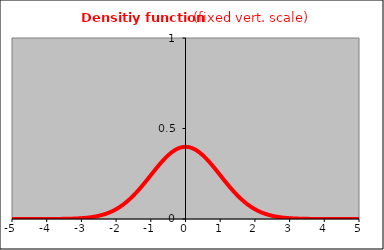
| Category | Series 0 |
|---|---|
| -10.0 | 0 |
| -9.9 | 0 |
| -9.8 | 0 |
| -9.7 | 0 |
| -9.6 | 0 |
| -9.5 | 0 |
| -9.4 | 0 |
| -9.3 | 0 |
| -9.2 | 0 |
| -9.1 | 0 |
| -9.0 | 0 |
| -8.9 | 0 |
| -8.8 | 0 |
| -8.7 | 0 |
| -8.6 | 0 |
| -8.5 | 0 |
| -8.40000000000001 | 0 |
| -8.30000000000001 | 0 |
| -8.20000000000001 | 0 |
| -8.10000000000001 | 0 |
| -8.00000000000001 | 0 |
| -7.90000000000001 | 0 |
| -7.80000000000001 | 0 |
| -7.70000000000001 | 0 |
| -7.60000000000001 | 0 |
| -7.50000000000001 | 0 |
| -7.40000000000001 | 0 |
| -7.30000000000001 | 0 |
| -7.20000000000001 | 0 |
| -7.10000000000001 | 0 |
| -7.00000000000001 | 0 |
| -6.90000000000001 | 0 |
| -6.80000000000001 | 0 |
| -6.70000000000001 | 0 |
| -6.60000000000001 | 0 |
| -6.50000000000001 | 0 |
| -6.40000000000001 | 0 |
| -6.30000000000001 | 0 |
| -6.20000000000001 | 0 |
| -6.10000000000001 | 0 |
| -6.00000000000001 | 0 |
| -5.90000000000001 | 0 |
| -5.80000000000001 | 0 |
| -5.70000000000001 | 0 |
| -5.60000000000002 | 0 |
| -5.50000000000002 | 0 |
| -5.40000000000002 | 0 |
| -5.30000000000002 | 0 |
| -5.20000000000002 | 0 |
| -5.10000000000002 | 0 |
| -5.00000000000002 | 0 |
| -4.90000000000002 | 0 |
| -4.80000000000002 | 0 |
| -4.70000000000002 | 0 |
| -4.60000000000002 | 0 |
| -4.50000000000002 | 0 |
| -4.40000000000002 | 0 |
| -4.30000000000002 | 0 |
| -4.20000000000002 | 0 |
| -4.10000000000002 | 0 |
| -4.00000000000002 | 0 |
| -3.90000000000002 | 0 |
| -3.80000000000002 | 0 |
| -3.70000000000002 | 0 |
| -3.60000000000002 | 0.001 |
| -3.50000000000002 | 0.001 |
| -3.40000000000002 | 0.001 |
| -3.30000000000002 | 0.002 |
| -3.20000000000002 | 0.002 |
| -3.10000000000002 | 0.003 |
| -3.00000000000002 | 0.004 |
| -2.90000000000002 | 0.006 |
| -2.80000000000003 | 0.008 |
| -2.70000000000003 | 0.01 |
| -2.60000000000003 | 0.014 |
| -2.50000000000003 | 0.018 |
| -2.40000000000003 | 0.022 |
| -2.30000000000003 | 0.028 |
| -2.20000000000003 | 0.035 |
| -2.10000000000003 | 0.044 |
| -2.00000000000003 | 0.054 |
| -1.90000000000003 | 0.066 |
| -1.80000000000003 | 0.079 |
| -1.70000000000003 | 0.094 |
| -1.60000000000003 | 0.111 |
| -1.50000000000003 | 0.13 |
| -1.40000000000003 | 0.15 |
| -1.30000000000003 | 0.171 |
| -1.20000000000003 | 0.194 |
| -1.10000000000003 | 0.218 |
| -1.00000000000003 | 0.242 |
| -0.900000000000031 | 0.266 |
| -0.800000000000031 | 0.29 |
| -0.700000000000029 | 0.312 |
| -0.60000000000003 | 0.333 |
| -0.50000000000003 | 0.352 |
| -0.400000000000031 | 0.368 |
| -0.300000000000031 | 0.381 |
| -0.200000000000029 | 0.391 |
| -0.10000000000003 | 0.397 |
| -4.08562073062058e-14 | 0.399 |
| 0.0999999999999588 | 0.397 |
| 0.199999999999999 | 0.391 |
| 0.299999999999999 | 0.381 |
| 0.4 | 0.368 |
| 0.5 | 0.352 |
| 0.6 | 0.333 |
| 0.699999999999999 | 0.312 |
| 0.799999999999999 | 0.29 |
| 0.9 | 0.266 |
| 1.0 | 0.242 |
| 1.1 | 0.218 |
| 1.2 | 0.194 |
| 1.3 | 0.171 |
| 1.4 | 0.15 |
| 1.5 | 0.13 |
| 1.6 | 0.111 |
| 1.7 | 0.094 |
| 1.8 | 0.079 |
| 1.9 | 0.066 |
| 2.0 | 0.054 |
| 2.1 | 0.044 |
| 2.2 | 0.035 |
| 2.3 | 0.028 |
| 2.4 | 0.022 |
| 2.5 | 0.018 |
| 2.6 | 0.014 |
| 2.7 | 0.01 |
| 2.8 | 0.008 |
| 2.9 | 0.006 |
| 3.0 | 0.004 |
| 3.1 | 0.003 |
| 3.2 | 0.002 |
| 3.3 | 0.002 |
| 3.4 | 0.001 |
| 3.5 | 0.001 |
| 3.6 | 0.001 |
| 3.7 | 0 |
| 3.8 | 0 |
| 3.9 | 0 |
| 4.0 | 0 |
| 4.1 | 0 |
| 4.1999999999999 | 0 |
| 4.2999999999999 | 0 |
| 4.3999999999999 | 0 |
| 4.4999999999999 | 0 |
| 4.5999999999999 | 0 |
| 4.6999999999999 | 0 |
| 4.7999999999999 | 0 |
| 4.8999999999999 | 0 |
| 4.9999999999999 | 0 |
| 5.0999999999999 | 0 |
| 5.1999999999999 | 0 |
| 5.2999999999999 | 0 |
| 5.3999999999999 | 0 |
| 5.4999999999999 | 0 |
| 5.5999999999999 | 0 |
| 5.6999999999999 | 0 |
| 5.7999999999999 | 0 |
| 5.8999999999999 | 0 |
| 5.9999999999999 | 0 |
| 6.0999999999999 | 0 |
| 6.1999999999999 | 0 |
| 6.2999999999999 | 0 |
| 6.3999999999999 | 0 |
| 6.4999999999999 | 0 |
| 6.5999999999999 | 0 |
| 6.6999999999999 | 0 |
| 6.7999999999999 | 0 |
| 6.8999999999999 | 0 |
| 6.9999999999999 | 0 |
| 7.0999999999999 | 0 |
| 7.1999999999999 | 0 |
| 7.2999999999999 | 0 |
| 7.3999999999999 | 0 |
| 7.4999999999999 | 0 |
| 7.5999999999999 | 0 |
| 7.6999999999999 | 0 |
| 7.7999999999999 | 0 |
| 7.8999999999999 | 0 |
| 7.9999999999999 | 0 |
| 8.0999999999999 | 0 |
| 8.1999999999999 | 0 |
| 8.2999999999999 | 0 |
| 8.3999999999999 | 0 |
| 8.4999999999999 | 0 |
| 8.5999999999999 | 0 |
| 8.6999999999999 | 0 |
| 8.7999999999999 | 0 |
| 8.8999999999999 | 0 |
| 8.9999999999999 | 0 |
| 9.0999999999999 | 0 |
| 9.1999999999999 | 0 |
| 9.2999999999999 | 0 |
| 9.3999999999999 | 0 |
| 9.4999999999999 | 0 |
| 9.5999999999999 | 0 |
| 9.6999999999999 | 0 |
| 9.7999999999999 | 0 |
| 9.8999999999999 | 0 |
| 9.9999999999999 | 0 |